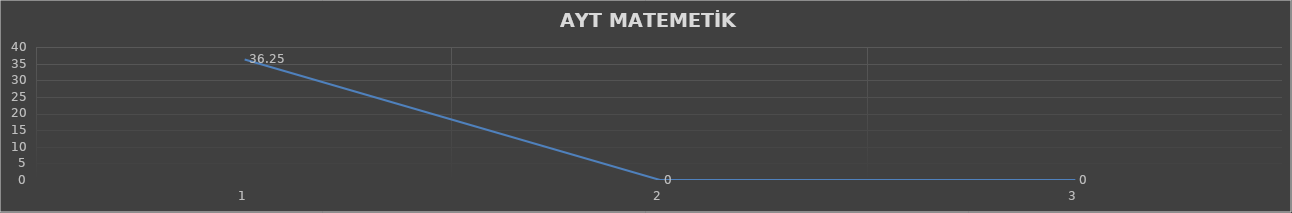
| Category | Series 0 |
|---|---|
| 0 | 36.25 |
| 1 | 0 |
| 2 | 0 |